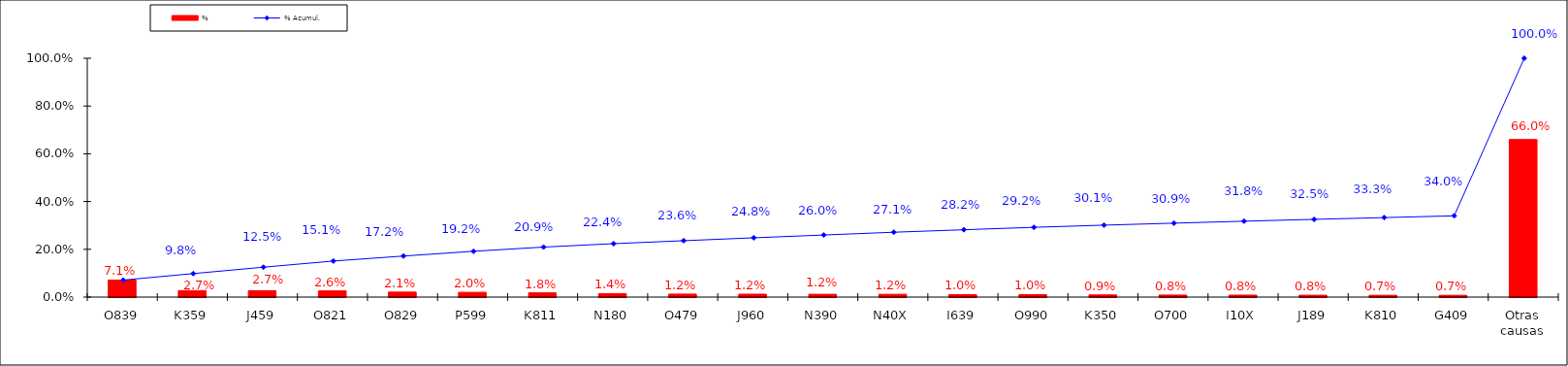
| Category | % |
|---|---|
| O839 | 0.071 |
| K359 | 0.027 |
| J459 | 0.027 |
| O821 | 0.026 |
| O829 | 0.021 |
| P599 | 0.02 |
| K811 | 0.018 |
| N180 | 0.014 |
| O479 | 0.012 |
| J960 | 0.012 |
| N390 | 0.012 |
| N40X | 0.012 |
| I639 | 0.01 |
| O990 | 0.01 |
| K350 | 0.009 |
| O700 | 0.008 |
| I10X | 0.008 |
| J189 | 0.008 |
| K810 | 0.007 |
| G409 | 0.007 |
| Otras causas | 0.66 |